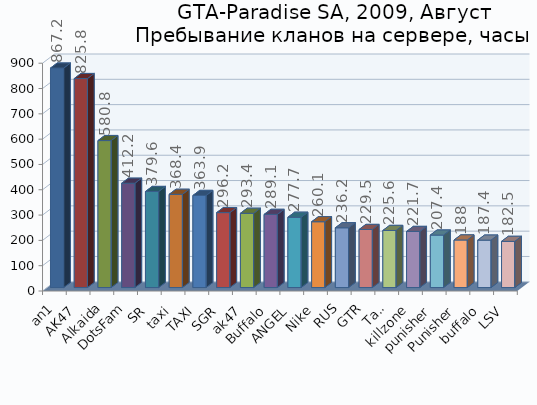
| Category | Series 0 |
|---|---|
| an1 | 867.2 |
| AK47 | 825.8 |
| Alkaida | 580.8 |
| DotsFam | 412.2 |
| SR | 379.6 |
| taxi | 368.4 |
| TAXI | 363.9 |
| SGR | 296.2 |
| ak47 | 293.4 |
| Buffalo | 289.1 |
| ANGEL | 277.7 |
| Nike | 260.1 |
| RUS | 236.2 |
| GTR | 229.5 |
| Taxi | 225.6 |
| killzone | 221.7 |
| punisher | 207.4 |
| Punisher | 188 |
| buffalo | 187.4 |
| LSV | 182.5 |